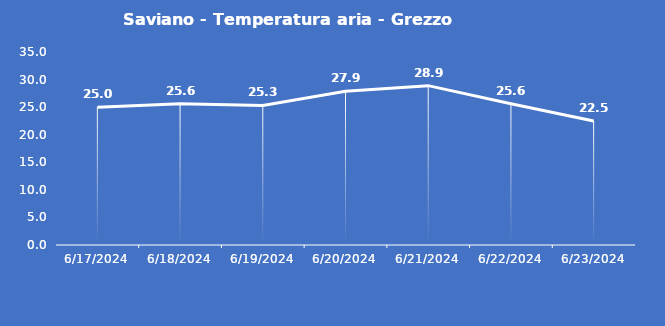
| Category | Saviano - Temperatura aria - Grezzo (°C) |
|---|---|
| 6/17/24 | 25 |
| 6/18/24 | 25.6 |
| 6/19/24 | 25.3 |
| 6/20/24 | 27.9 |
| 6/21/24 | 28.9 |
| 6/22/24 | 25.6 |
| 6/23/24 | 22.5 |